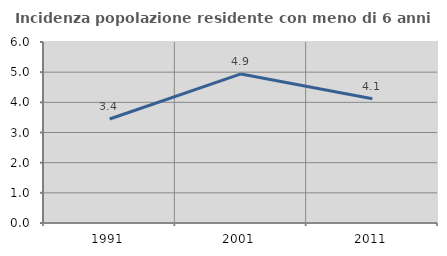
| Category | Incidenza popolazione residente con meno di 6 anni |
|---|---|
| 1991.0 | 3.448 |
| 2001.0 | 4.942 |
| 2011.0 | 4.119 |